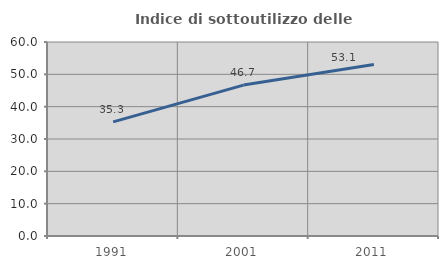
| Category | Indice di sottoutilizzo delle abitazioni  |
|---|---|
| 1991.0 | 35.284 |
| 2001.0 | 46.677 |
| 2011.0 | 53.051 |